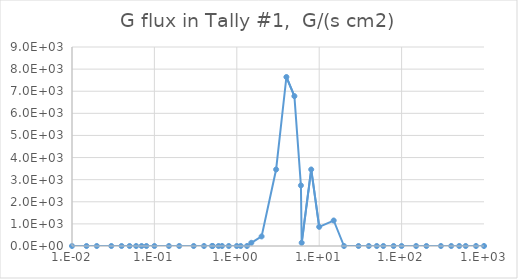
| Category | Series 0 |
|---|---|
| 0.01 | 0 |
| 0.015 | 0 |
| 0.02 | 0 |
| 0.03 | 0 |
| 0.04 | 0 |
| 0.05 | 0 |
| 0.06 | 0 |
| 0.07 | 0 |
| 0.08 | 0 |
| 0.1 | 0 |
| 0.15 | 0 |
| 0.2 | 0 |
| 0.3 | 0 |
| 0.4 | 0 |
| 0.5 | 0 |
| 0.511 | 0 |
| 0.6 | 0 |
| 0.662 | 0 |
| 0.8 | 0 |
| 1.0 | 0 |
| 1.117 | 0 |
| 1.33 | 0 |
| 1.5 | 144.205 |
| 2.0 | 432.611 |
| 3.0 | 3460.88 |
| 4.0 | 7642.79 |
| 5.0 | 6777.56 |
| 6.0 | 2739.87 |
| 6.129 | 144.203 |
| 8.0 | 3460.88 |
| 10.0 | 865.221 |
| 15.0 | 1153.63 |
| 20.0 | 0 |
| 30.0 | 0 |
| 40.0 | 0 |
| 50.0 | 0 |
| 60.0 | 0 |
| 80.0 | 0 |
| 100.0 | 0 |
| 150.0 | 0 |
| 200.0 | 0 |
| 300.0 | 0 |
| 400.0 | 0 |
| 500.0 | 0 |
| 600.0 | 0 |
| 800.0 | 0 |
| 1000.0 | 0 |
| 1500.0 | 0 |
| 2000.0 | 0 |
| 3000.0 | 0 |
| 4000.0 | 0 |
| 5000.0 | 0 |
| 6000.0 | 0 |
| 8000.0 | 0 |
| 10000.0 | 0 |